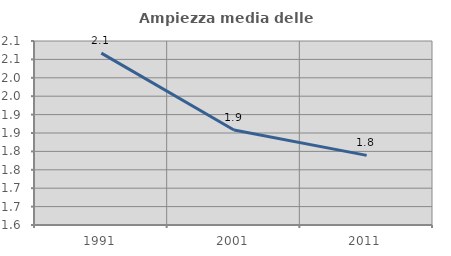
| Category | Ampiezza media delle famiglie |
|---|---|
| 1991.0 | 2.067 |
| 2001.0 | 1.858 |
| 2011.0 | 1.789 |